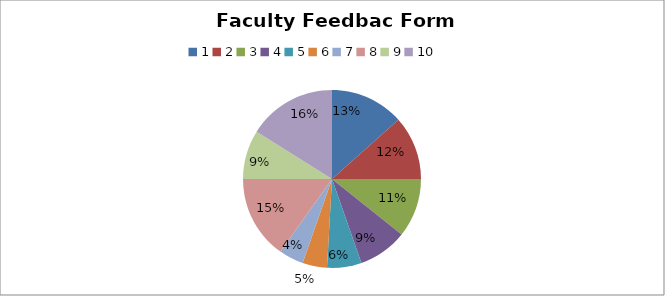
| Category | Series 0 | Series 1 | Series 2 |
|---|---|---|---|
| 0 | 15 | 17 | 2 |
| 1 | 13 | 13 | 4 |
| 2 | 12 | 15 | 1 |
| 3 | 10 | 17 | 3 |
| 4 | 7 | 20 | 0 |
| 5 | 5 | 21 | 2 |
| 6 | 5 | 20 | 1 |
| 7 | 17 | 7 | 2 |
| 8 | 10 | 20 | 0 |
| 9 | 18 | 8 | 1 |